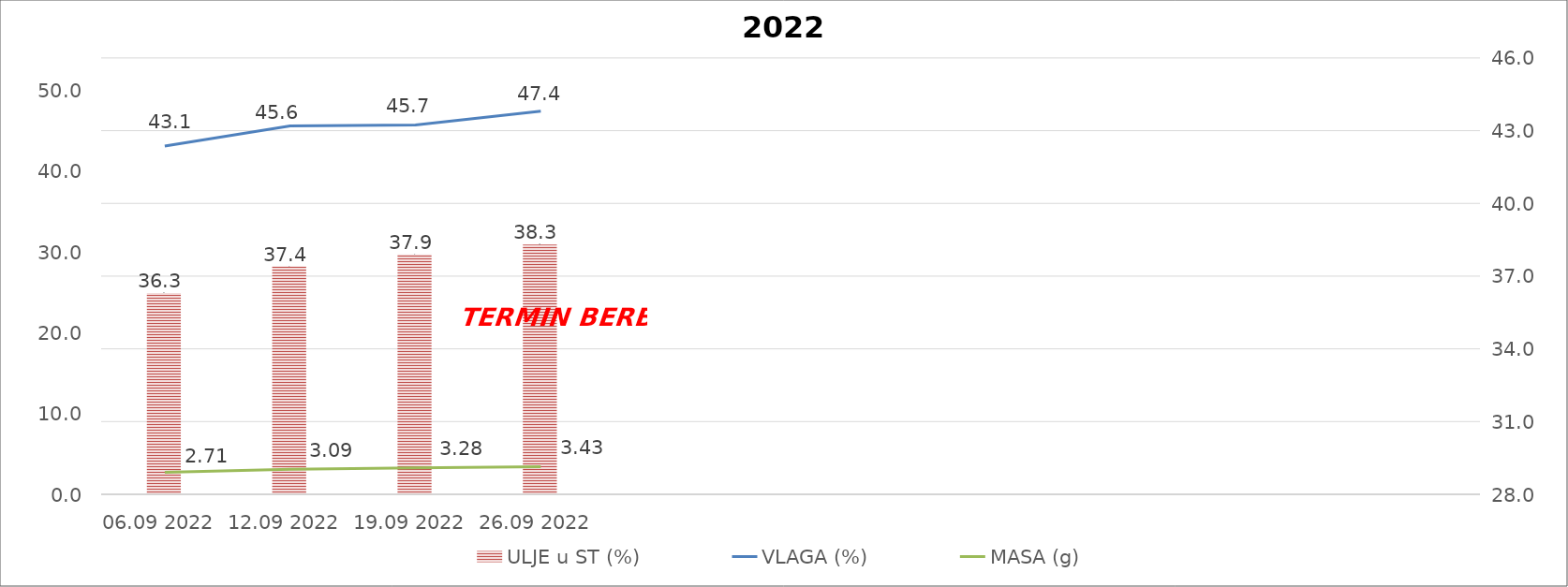
| Category | ULJE u ST (%) |
|---|---|
| 06.09 2022 | 36.3 |
| 12.09 2022 | 37.4 |
| 19.09 2022 | 37.9 |
| 26.09 2022 | 38.3 |